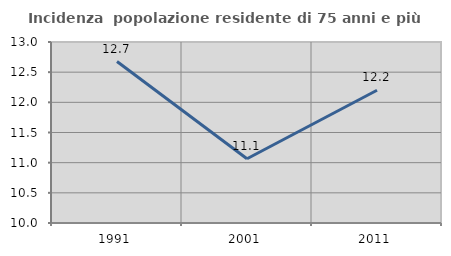
| Category | Incidenza  popolazione residente di 75 anni e più |
|---|---|
| 1991.0 | 12.676 |
| 2001.0 | 11.066 |
| 2011.0 | 12.2 |